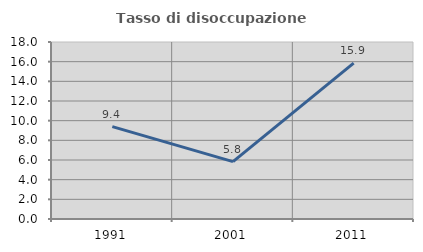
| Category | Tasso di disoccupazione giovanile  |
|---|---|
| 1991.0 | 9.392 |
| 2001.0 | 5.839 |
| 2011.0 | 15.854 |